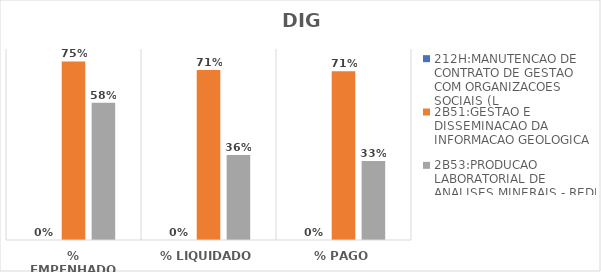
| Category | 212H:MANUTENCAO DE CONTRATO DE GESTAO COM ORGANIZACOES SOCIAIS (L | 2B51:GESTAO E DISSEMINACAO DA INFORMACAO GEOLOGICA | 2B53:PRODUCAO LABORATORIAL DE ANALISES MINERAIS - REDE LAMIN |
|---|---|---|---|
| % EMPENHADO | 0 | 0.748 | 0.575 |
| % LIQUIDADO | 0 | 0.712 | 0.356 |
| % PAGO | 0 | 0.707 | 0.331 |